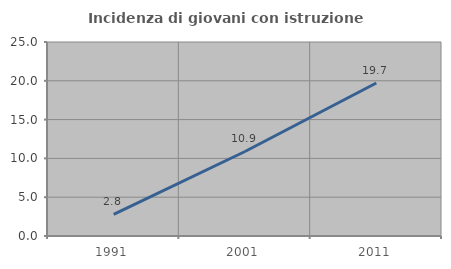
| Category | Incidenza di giovani con istruzione universitaria |
|---|---|
| 1991.0 | 2.778 |
| 2001.0 | 10.891 |
| 2011.0 | 19.718 |